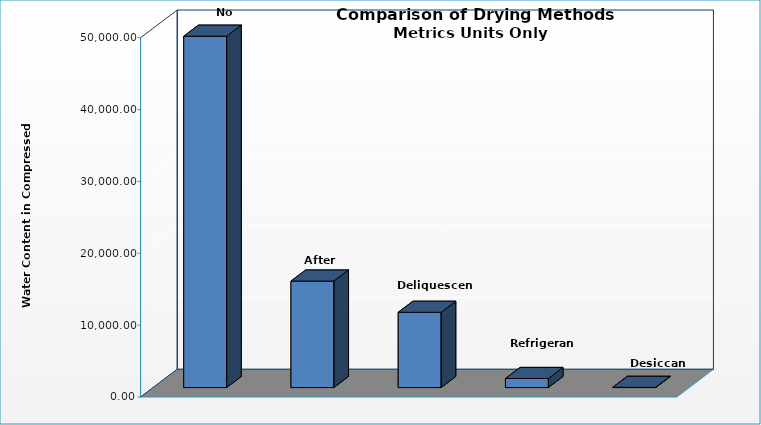
| Category | Series 0 |
|---|---|
| No Treatment | 48900.866 |
| After Cooler | 14819.469 |
| Deliquescent | 10474.652 |
| Refrigerant | 1261.208 |
| Desiccant | 27.07 |